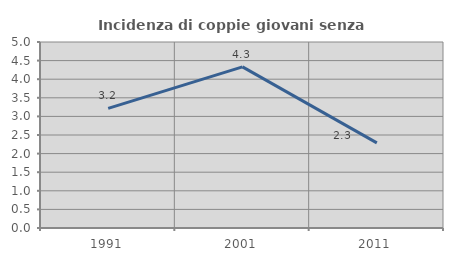
| Category | Incidenza di coppie giovani senza figli |
|---|---|
| 1991.0 | 3.217 |
| 2001.0 | 4.333 |
| 2011.0 | 2.288 |